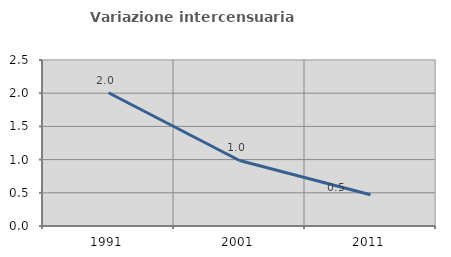
| Category | Variazione intercensuaria annua |
|---|---|
| 1991.0 | 2.007 |
| 2001.0 | 0.987 |
| 2011.0 | 0.472 |